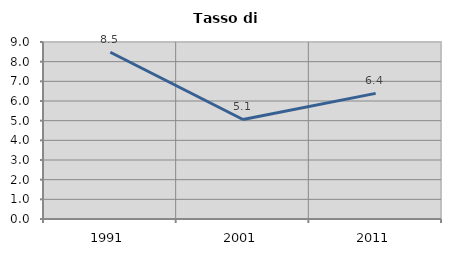
| Category | Tasso di disoccupazione   |
|---|---|
| 1991.0 | 8.477 |
| 2001.0 | 5.06 |
| 2011.0 | 6.387 |